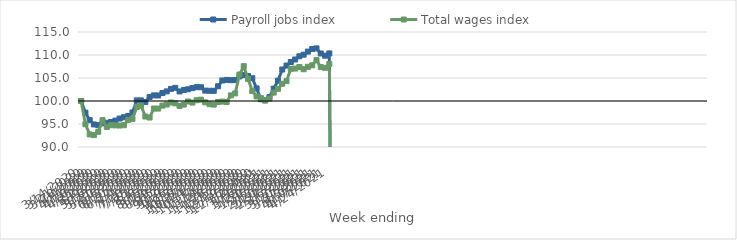
| Category | Payroll jobs index | Total wages index |
|---|---|---|
| 14/03/2020 | 100 | 100 |
| 21/03/2020 | 97.464 | 94.957 |
| 28/03/2020 | 95.837 | 92.735 |
| 04/04/2020 | 94.907 | 92.593 |
| 11/04/2020 | 94.75 | 93.304 |
| 18/04/2020 | 95.149 | 95.833 |
| 25/04/2020 | 95.258 | 94.366 |
| 02/05/2020 | 95.43 | 94.748 |
| 09/05/2020 | 95.738 | 94.707 |
| 16/05/2020 | 96.187 | 94.668 |
| 23/05/2020 | 96.469 | 94.738 |
| 30/05/2020 | 96.752 | 95.886 |
| 06/06/2020 | 97.503 | 96.116 |
| 13/06/2020 | 100.128 | 98.687 |
| 20/06/2020 | 100.126 | 99.003 |
| 27/06/2020 | 99.795 | 96.621 |
| 04/07/2020 | 100.88 | 96.405 |
| 11/07/2020 | 101.217 | 98.365 |
| 18/07/2020 | 101.201 | 98.352 |
| 25/07/2020 | 101.738 | 98.997 |
| 01/08/2020 | 102.089 | 99.237 |
| 08/08/2020 | 102.628 | 99.679 |
| 15/08/2020 | 102.859 | 99.489 |
| 22/08/2020 | 102.072 | 98.93 |
| 29/08/2020 | 102.398 | 99.226 |
| 05/09/2020 | 102.548 | 99.888 |
| 12/09/2020 | 102.808 | 99.664 |
| 19/09/2020 | 103.002 | 100.169 |
| 26/09/2020 | 102.992 | 100.295 |
| 03/10/2020 | 102.256 | 99.703 |
| 10/10/2020 | 102.22 | 99.306 |
| 17/10/2020 | 102.212 | 99.221 |
| 24/10/2020 | 103.208 | 99.792 |
| 31/10/2020 | 104.463 | 99.875 |
| 07/11/2020 | 104.583 | 99.78 |
| 14/11/2020 | 104.522 | 101.224 |
| 21/11/2020 | 104.549 | 101.648 |
| 28/11/2020 | 105.337 | 105.755 |
| 05/12/2020 | 105.635 | 107.568 |
| 12/12/2020 | 105.432 | 104.813 |
| 19/12/2020 | 104.962 | 102.149 |
| 26/12/2020 | 102.734 | 100.993 |
| 02/01/2021 | 100.385 | 100.647 |
| 09/01/2021 | 100.149 | 100.107 |
| 16/01/2021 | 100.85 | 100.516 |
| 23/01/2021 | 102.679 | 101.83 |
| 30/01/2021 | 104.413 | 102.646 |
| 06/02/2021 | 106.842 | 103.75 |
| 13/02/2021 | 107.705 | 104.325 |
| 20/02/2021 | 108.475 | 107.002 |
| 27/02/2021 | 109.028 | 107.055 |
| 06/03/2021 | 109.72 | 107.39 |
| 13/03/2021 | 110.069 | 106.9 |
| 20/03/2021 | 110.74 | 107.438 |
| 27/03/2021 | 111.299 | 107.756 |
| 03/04/2021 | 111.442 | 108.888 |
| 10/04/2021 | 110.321 | 107.373 |
| 17/04/2021 | 109.853 | 107.217 |
| 24/04/2021 | 110.345 | 108.042 |